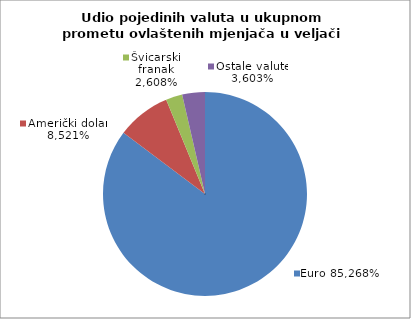
| Category | EUR |
|---|---|
| 0 | 0.853 |
| 1 | 0.085 |
| 2 | 0.026 |
| 3 | 0.036 |